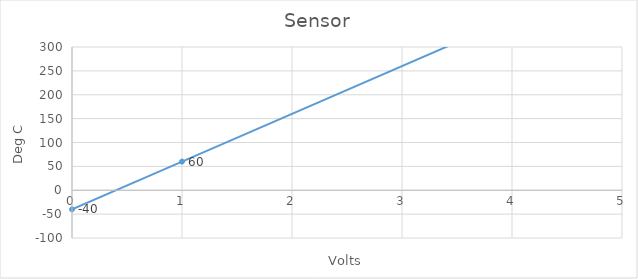
| Category | Series 0 |
|---|---|
| 0.0 | -40 |
| 1.0 | 60 |
| 5.0 | 460 |